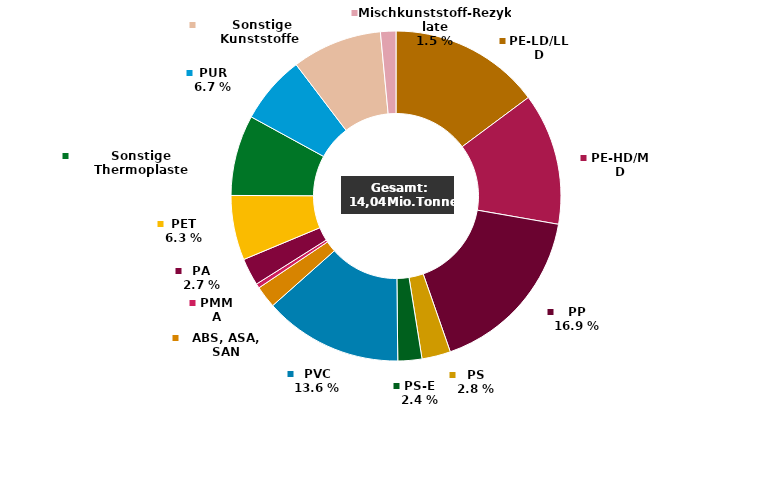
| Category | Series 0 |
|---|---|
| PE-LD/LLD | 2080 |
| PE-HD/MD | 1815 |
| PP | 2375 |
| PS | 395 |
| PS-E | 330 |
| PVC | 1910 |
| ABS, ASA, SAN | 305 |
| PMMA | 61 |
| PA | 375 |
| PET | 890 |
| Sonstige Thermoplaste | 1110 |
| PUR | 940 |
| Sonstige Kunststoffe  | 1240 |
| Mischkunststoff-Rezyklate | 212 |